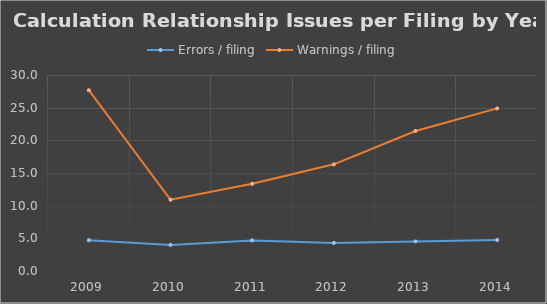
| Category | Errors / filing | Warnings / filing |
|---|---|---|
| 2009.0 | 4.715 | 27.672 |
| 2010.0 | 3.99 | 10.91 |
| 2011.0 | 4.676 | 13.348 |
| 2012.0 | 4.295 | 16.326 |
| 2013.0 | 4.529 | 21.429 |
| 2014.0 | 4.744 | 24.886 |